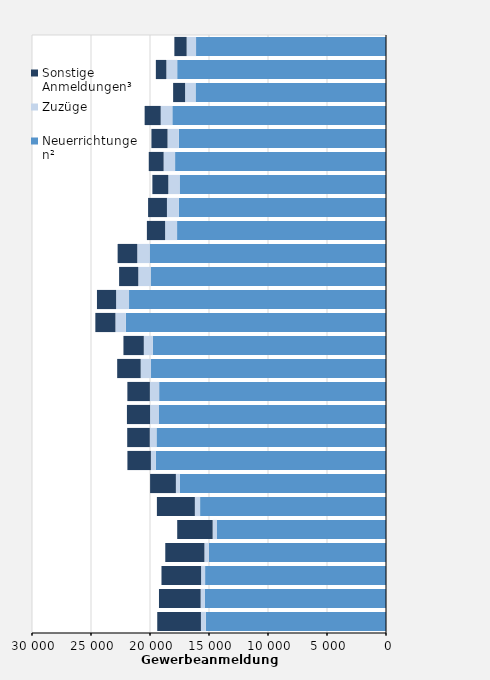
| Category | Neuerrichtungen² | Zuzüge | Sonstige Anmeldungen³ |
|---|---|---|---|
| 1997.0 | 15269 | 415 | 3702 |
| 1998.0 | 15365 | 343 | 3531 |
| 1999.0 | 15331 | 339 | 3357 |
| 2000.0 | 15016 | 373 | 3316 |
| 2001.0 | 14323 | 368 | 3003 |
| 2002.0 | 15755 | 444 | 3217 |
| 2003.0 | 17485 | 322 | 2185 |
| 2004.0 | 19499 | 426 | 1989 |
| 2005.0 | 19452 | 567 | 1912 |
| 2006.0 | 19238 | 757 | 1960 |
| 2007.0 | 19225 | 786 | 1907 |
| 2008.0 | 19914 | 876 | 1991 |
| 2009.0 | 19769 | 757 | 1724 |
| 2010.0 | 22046 | 885 | 1701 |
| 2011.0 | 21777 | 1095 | 1623 |
| 2012.0 | 19945 | 1049 | 1624 |
| 2013.0 | 20029 | 1051 | 1663 |
| 2014.0 | 17706 | 1013 | 1545 |
| 2015.0 | 17566 | 998 | 1598 |
| 2016.0 | 17492 | 957 | 1349 |
| 2017.0 | 17874 | 972 | 1259 |
| 2018.0 | 17558 | 958 | 1364 |
| 2019.0 | 18108 | 986 | 1360 |
| 2020.0 | 16141 | 885 | 1014 |
| 2021.0 | 17696 | 919 | 889 |
| 2022.0 | 16098 | 798 | 1039 |